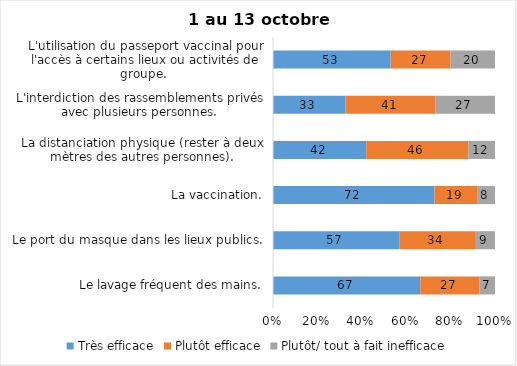
| Category | Très efficace | Plutôt efficace | Plutôt/ tout à fait inefficace |
|---|---|---|---|
| Le lavage fréquent des mains. | 67 | 27 | 7 |
| Le port du masque dans les lieux publics. | 57 | 34 | 9 |
| La vaccination. | 72 | 19 | 8 |
| La distanciation physique (rester à deux mètres des autres personnes). | 42 | 46 | 12 |
| L'interdiction des rassemblements privés avec plusieurs personnes. | 33 | 41 | 27 |
| L'utilisation du passeport vaccinal pour l'accès à certains lieux ou activités de groupe.  | 53 | 27 | 20 |